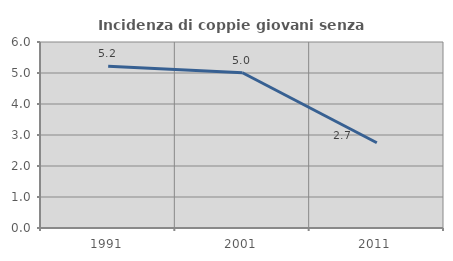
| Category | Incidenza di coppie giovani senza figli |
|---|---|
| 1991.0 | 5.221 |
| 2001.0 | 5.008 |
| 2011.0 | 2.75 |